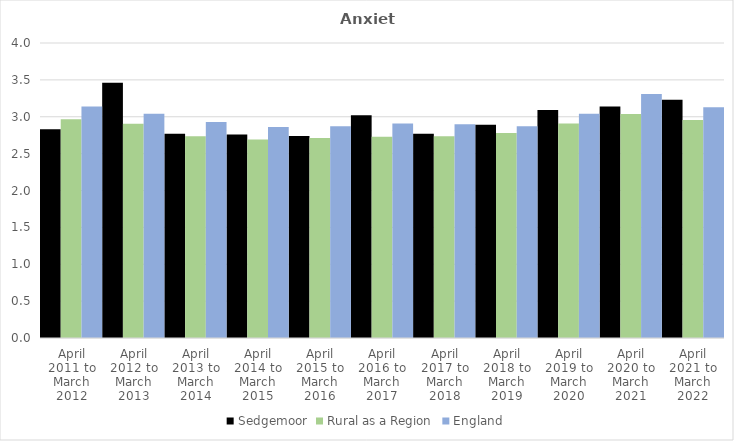
| Category | Sedgemoor | Rural as a Region | England |
|---|---|---|---|
| April 2011 to March 2012 | 2.83 | 2.967 | 3.14 |
| April 2012 to March 2013 | 3.46 | 2.904 | 3.04 |
| April 2013 to March 2014 | 2.77 | 2.734 | 2.93 |
| April 2014 to March 2015 | 2.76 | 2.691 | 2.86 |
| April 2015 to March 2016 | 2.74 | 2.711 | 2.87 |
| April 2016 to March 2017 | 3.02 | 2.729 | 2.91 |
| April 2017 to March 2018 | 2.77 | 2.736 | 2.9 |
| April 2018 to March 2019 | 2.89 | 2.78 | 2.87 |
| April 2019 to March 2020 | 3.09 | 2.908 | 3.04 |
| April 2020 to March 2021 | 3.14 | 3.036 | 3.31 |
| April 2021 to March 2022 | 3.23 | 2.956 | 3.13 |